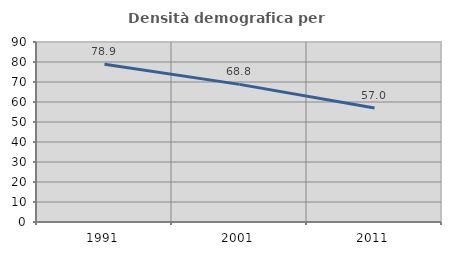
| Category | Densità demografica |
|---|---|
| 1991.0 | 78.889 |
| 2001.0 | 68.82 |
| 2011.0 | 57.038 |